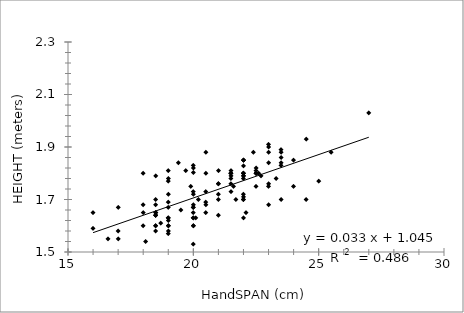
| Category | Series 0 |
|---|---|
| 18.5 | 1.64 |
| 19.0 | 1.62 |
| 19.5 | 1.66 |
| 18.5 | 1.65 |
| 19.0 | 1.6 |
| 20.5 | 1.69 |
| 18.7 | 1.61 |
| 22.0 | 1.63 |
| 20.0 | 1.63 |
| 19.0 | 1.77 |
| 18.0 | 1.8 |
| 17.0 | 1.55 |
| 20.0 | 1.53 |
| 18.5 | 1.58 |
| 19.0 | 1.72 |
| 16.6 | 1.55 |
| 20.1 | 1.63 |
| 18.5 | 1.6 |
| 18.5 | 1.65 |
| 19.9 | 1.75 |
| 19.0 | 1.81 |
| 16.0 | 1.65 |
| 22.0 | 1.7 |
| 20.0 | 1.65 |
| 21.0 | 1.76 |
| 16.0 | 1.59 |
| 21.5 | 1.73 |
| 19.0 | 1.6 |
| 21.7 | 1.7 |
| 20.0 | 1.6 |
| 19.0 | 1.58 |
| 18.0 | 1.68 |
| 19.0 | 1.69 |
| 23.5 | 1.7 |
| 18.0 | 1.6 |
| 19.0 | 1.57 |
| 20.0 | 1.63 |
| 20.5 | 1.65 |
| 20.0 | 1.72 |
| 20.0 | 1.6 |
| 20.0 | 1.67 |
| 20.0 | 1.68 |
| 20.0 | 1.73 |
| 18.5 | 1.6 |
| 19.0 | 1.63 |
| 21.0 | 1.7 |
| 21.0 | 1.76 |
| 21.0 | 1.72 |
| 22.0 | 1.71 |
| 19.0 | 1.63 |
| 18.5 | 1.64 |
| 17.0 | 1.58 |
| 18.5 | 1.64 |
| 18.0 | 1.65 |
| 18.5 | 1.7 |
| 20.0 | 1.82 |
| 23.5 | 1.89 |
| 23.5 | 1.86 |
| 24.5 | 1.7 |
| 22.0 | 1.8 |
| 22.0 | 1.79 |
| 20.5 | 1.8 |
| 19.0 | 1.78 |
| 22.5 | 1.8 |
| 18.5 | 1.79 |
| 19.4 | 1.84 |
| 22.0 | 1.79 |
| 22.0 | 1.7 |
| 23.5 | 1.84 |
| 23.0 | 1.75 |
| 21.6 | 1.75 |
| 20.0 | 1.803 |
| 17.0 | 1.67 |
| 18.5 | 1.68 |
| 21.0 | 1.64 |
| 20.5 | 1.68 |
| 22.5 | 1.75 |
| 22.0 | 1.85 |
| 23.0 | 1.84 |
| 20.0 | 1.83 |
| 25.5 | 1.88 |
| 18.1 | 1.54 |
| 22.0 | 1.85 |
| 21.5 | 1.76 |
| 22.5 | 1.81 |
| 20.5 | 1.88 |
| 24.5 | 1.93 |
| 21.0 | 1.81 |
| 21.5 | 1.8 |
| 22.5 | 1.8 |
| 23.0 | 1.91 |
| 23.5 | 1.83 |
| 22.1 | 1.65 |
| 22.4 | 1.88 |
| 19.0 | 1.67 |
| 24.0 | 1.75 |
| 22.0 | 1.78 |
| 19.7 | 1.81 |
| 23.0 | 1.9 |
| 22.0 | 1.828 |
| 21.5 | 1.78 |
| 22.5 | 1.8 |
| 23.5 | 1.88 |
| 22.0 | 1.72 |
| 22.0 | 1.8 |
| 22.5 | 1.82 |
| 21.5 | 1.8 |
| 24.0 | 1.85 |
| 25.0 | 1.77 |
| 21.5 | 1.79 |
| 22.5 | 1.8 |
| 21.5 | 1.8 |
| 20.2 | 1.7 |
| 23.0 | 1.88 |
| 21.5 | 1.81 |
| 22.6 | 1.8 |
| 23.0 | 1.68 |
| 23.0 | 1.76 |
| 22.0 | 1.8 |
| 22.7 | 1.79 |
| 23.3 | 1.78 |
| 20.5 | 1.73 |
| 27.0 | 2.03 |
| 20.0 | 1.67 |
| 22.0 | 1.85 |